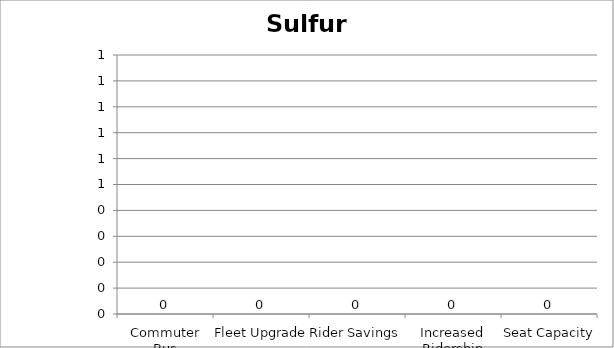
| Category | Sulfur Oxides |
|---|---|
| Commuter Bus | 0 |
| Fleet Upgrade | 0 |
| Rider Savings | 0 |
| Increased Ridership | 0 |
| Seat Capacity | 0 |